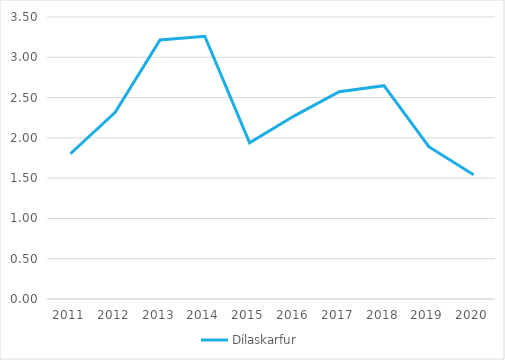
| Category | Dílaskarfur |
|---|---|
| 2011.0 | 1.802 |
| 2012.0 | 2.318 |
| 2013.0 | 3.214 |
| 2014.0 | 3.261 |
| 2015.0 | 1.94 |
| 2016.0 | 2.273 |
| 2017.0 | 2.573 |
| 2018.0 | 2.647 |
| 2019.0 | 1.89 |
| 2020.0 | 1.543 |